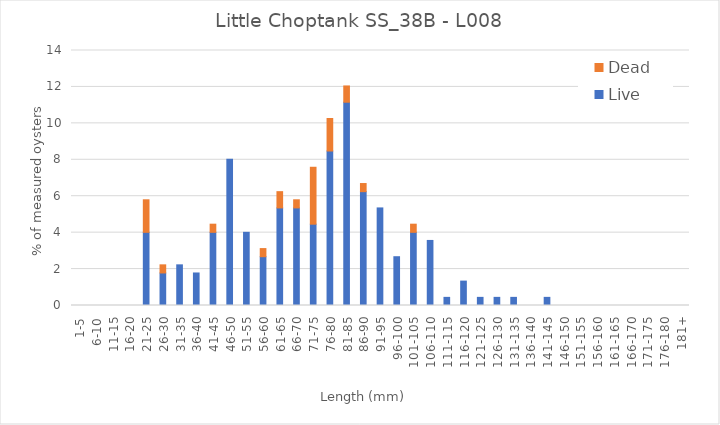
| Category | Live | Dead |
|---|---|---|
| 1-5 | 0 | 0 |
| 6-10 | 0 | 0 |
| 11-15 | 0 | 0 |
| 16-20 | 0 | 0 |
| 21-25 | 4.018 | 1.786 |
| 26-30 | 1.786 | 0.446 |
| 31-35 | 2.232 | 0 |
| 36-40 | 1.786 | 0 |
| 41-45 | 4.018 | 0.446 |
| 46-50 | 8.036 | 0 |
| 51-55 | 4.018 | 0 |
| 56-60 | 2.679 | 0.446 |
| 61-65 | 5.357 | 0.893 |
| 66-70 | 5.357 | 0.446 |
| 71-75 | 4.464 | 3.125 |
| 76-80 | 8.482 | 1.786 |
| 81-85 | 11.161 | 0.893 |
| 86-90 | 6.25 | 0.446 |
| 91-95 | 5.357 | 0 |
| 96-100 | 2.679 | 0 |
| 101-105 | 4.018 | 0.446 |
| 106-110 | 3.571 | 0 |
| 111-115 | 0.446 | 0 |
| 116-120 | 1.339 | 0 |
| 121-125 | 0.446 | 0 |
| 126-130 | 0.446 | 0 |
| 131-135 | 0.446 | 0 |
| 136-140 | 0 | 0 |
| 141-145 | 0.446 | 0 |
| 146-150 | 0 | 0 |
| 151-155 | 0 | 0 |
| 156-160 | 0 | 0 |
| 161-165 | 0 | 0 |
| 166-170 | 0 | 0 |
| 171-175 | 0 | 0 |
| 176-180 | 0 | 0 |
| 181+ | 0 | 0 |